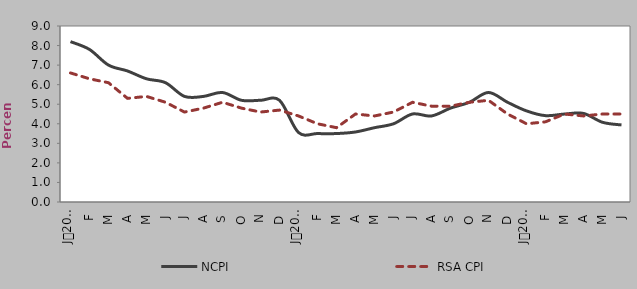
| Category | NCPI | RSA CPI |
|---|---|---|
| 0 | 8.2 | 6.6 |
| 1900-01-01 | 7.8 | 6.3 |
| 1900-01-02 | 7 | 6.1 |
| 1900-01-03 | 6.7 | 5.3 |
| 1900-01-04 | 6.3 | 5.4 |
| 1900-01-05 | 6.1 | 5.1 |
| 1900-01-06 | 5.4 | 4.6 |
| 1900-01-07 | 5.4 | 4.8 |
| 1900-01-08 | 5.6 | 5.1 |
| 1900-01-09 | 5.2 | 4.8 |
| 1900-01-10 | 5.2 | 4.6 |
| 1900-01-11 | 5.2 | 4.7 |
| 1900-01-12 | 3.555 | 4.4 |
| 1900-01-13 | 3.5 | 4 |
| 1900-01-14 | 3.5 | 3.8 |
| 1900-01-15 | 3.581 | 4.5 |
| 1900-01-16 | 3.8 | 4.4 |
| 1900-01-17 | 4 | 4.6 |
| 1900-01-18 | 4.5 | 5.1 |
| 1900-01-19 | 4.4 | 4.9 |
| 1900-01-20 | 4.8 | 4.9 |
| 1900-01-21 | 5.1 | 5.1 |
| 1900-01-22 | 5.6 | 5.2 |
| 1900-01-23 | 5.1 | 4.5 |
| 1900-01-24 | 4.658 | 4 |
| 1900-01-25 | 4.416 | 4.1 |
| 1900-01-26 | 4.498 | 4.5 |
| 1900-01-27 | 4.529 | 4.4 |
| 1900-01-28 | 4.076 | 4.5 |
| 1900-01-29 | 3.939 | 4.5 |